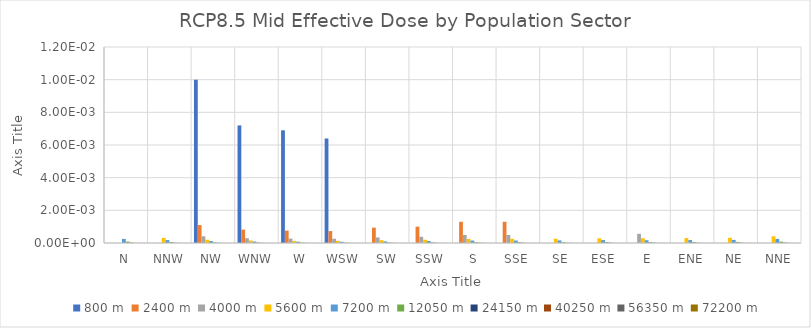
| Category | 800 m | 2400 m | 4000 m | 5600 m | 7200 m | 12050 m | 24150 m | 40250 m | 56350 m | 72200 m |
|---|---|---|---|---|---|---|---|---|---|---|
| N | 0 | 0 | 0 | 0 | 0 | 0 | 0 | 0 | 0 | 0 |
| NNW | 0 | 0 | 0 | 0 | 0 | 0 | 0 | 0 | 0 | 0 |
| NW | 0.01 | 0.001 | 0 | 0 | 0 | 0 | 0 | 0 | 0 | 0 |
| WNW | 0.007 | 0.001 | 0 | 0 | 0 | 0 | 0 | 0 | 0 | 0 |
| W | 0.007 | 0.001 | 0 | 0 | 0 | 0 | 0 | 0 | 0 | 0 |
| WSW | 0.006 | 0.001 | 0 | 0 | 0 | 0 | 0 | 0 | 0 | 0 |
| SW | 0 | 0.001 | 0 | 0 | 0 | 0 | 0 | 0 | 0 | 0 |
| SSW | 0 | 0.001 | 0 | 0 | 0 | 0 | 0 | 0 | 0 | 0 |
| S | 0 | 0.001 | 0 | 0 | 0 | 0 | 0 | 0 | 0 | 0 |
| SSE | 0 | 0.001 | 0 | 0 | 0 | 0 | 0 | 0 | 0 | 0 |
| SE | 0 | 0 | 0 | 0 | 0 | 0 | 0 | 0 | 0 | 0 |
| ESE | 0 | 0 | 0 | 0 | 0 | 0 | 0 | 0 | 0 | 0 |
| E | 0 | 0 | 0.001 | 0 | 0 | 0 | 0 | 0 | 0 | 0 |
| ENE | 0 | 0 | 0 | 0 | 0 | 0 | 0 | 0 | 0 | 0 |
| NE | 0 | 0 | 0 | 0 | 0 | 0 | 0 | 0 | 0 | 0 |
| NNE | 0 | 0 | 0 | 0 | 0 | 0 | 0 | 0 | 0 | 0 |